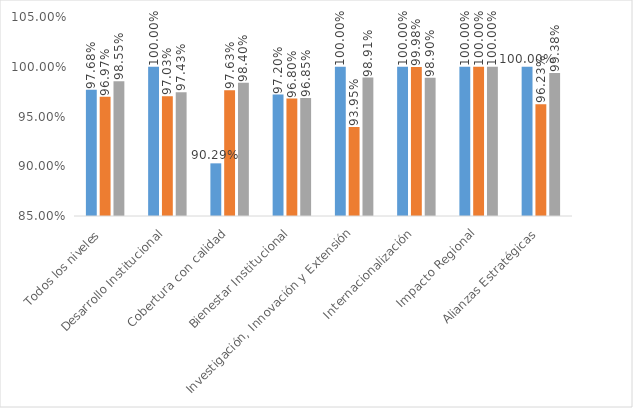
| Category | Objetivo | Componentes | Proyectos |
|---|---|---|---|
| Todos los niveles | 0.977 | 0.97 | 0.986 |
| Desarrollo Institucional | 1 | 0.97 | 0.974 |
| Cobertura con calidad | 0.903 | 0.976 | 0.984 |
| Bienestar Institucional | 0.972 | 0.968 | 0.969 |
| Investigación, Innovación y Extensión | 1 | 0.939 | 0.989 |
| Internacionalización | 1 | 1 | 0.989 |
| Impacto Regional | 1 | 1 | 1 |
| Alianzas Estratégicas | 1 | 0.962 | 0.994 |